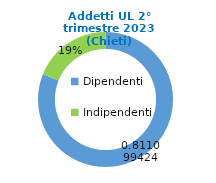
| Category | Series 0 |
|---|---|
| Dipendenti | 106413 |
| Indipendenti | 24783 |